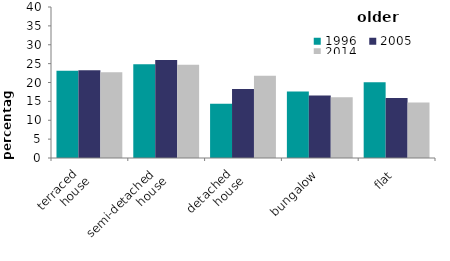
| Category | 1996 | 2005 | 2014 |
|---|---|---|---|
| terraced 
house | 23.083 | 23.27 | 22.748 |
| semi-detached 
house | 24.837 | 25.953 | 24.699 |
| detached 
house | 14.382 | 18.283 | 21.771 |
| bungalow | 17.606 | 16.582 | 16.061 |
| flat | 20.093 | 15.911 | 14.722 |